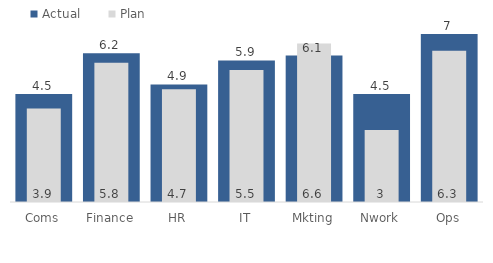
| Category | Actual |
|---|---|
| Coms | 4.5 |
| Finance | 6.2 |
| HR | 4.9 |
| IT | 5.9 |
| Mkting | 6.1 |
| Nwork | 4.5 |
| Ops | 7 |